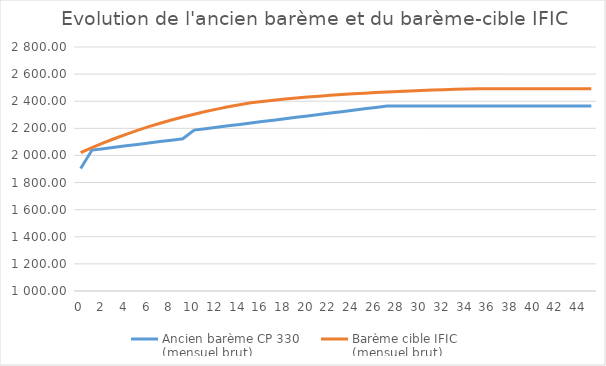
| Category | Ancien barème CP 330 
(mensuel brut) | Barème cible | Barème cible IFIC 
(mensuel brut) |
|---|---|---|---|
| 0.0 | 1903.62 |  | 2020.3 |
| 1.0 | 2039.52 |  | 2057.37 |
| 2.0 | 2049.96 |  | 2092.28 |
| 3.0 | 2060.39 |  | 2125.13 |
| 4.0 | 2070.83 |  | 2155.99 |
| 5.0 | 2081.26 |  | 2184.95 |
| 6.0 | 2091.69 |  | 2212.09 |
| 7.0 | 2102.12 |  | 2237.51 |
| 8.0 | 2112.55 |  | 2261.29 |
| 9.0 | 2122.99 |  | 2283.52 |
| 10.0 | 2187.23 |  | 2304.29 |
| 11.0 | 2197.66 |  | 2323.68 |
| 12.0 | 2208.1 |  | 2341.75 |
| 13.0 | 2218.53 |  | 2358.6 |
| 14.0 | 2228.96 |  | 2374.31 |
| 15.0 | 2239.4 |  | 2388.93 |
| 16.0 | 2249.83 |  | 2398.6 |
| 17.0 | 2260.26 |  | 2407.58 |
| 18.0 | 2270.7 |  | 2415.91 |
| 19.0 | 2281.13 |  | 2423.64 |
| 20.0 | 2291.57 |  | 2430.83 |
| 21.0 | 2302 |  | 2437.48 |
| 22.0 | 2312.43 |  | 2443.66 |
| 23.0 | 2322.87 |  | 2449.39 |
| 24.0 | 2333.3 |  | 2454.7 |
| 25.0 | 2343.73 |  | 2459.63 |
| 26.0 | 2354.17 |  | 2464.19 |
| 27.0 | 2364.6 |  | 2468.41 |
| 28.0 | 2364.6 |  | 2472.34 |
| 29.0 | 2364.6 |  | 2475.97 |
| 30.0 | 2364.6 |  | 2479.33 |
| 31.0 | 2364.6 |  | 2482.44 |
| 32.0 | 2364.6 |  | 2485.33 |
| 33.0 | 2364.6 |  | 2488 |
| 34.0 | 2364.6 |  | 2490.48 |
| 35.0 | 2364.6 |  | 2492.77 |
| 36.0 | 2364.6 |  | 2492.77 |
| 37.0 | 2364.6 |  | 2492.77 |
| 38.0 | 2364.6 |  | 2492.77 |
| 39.0 | 2364.6 |  | 2492.77 |
| 40.0 | 2364.6 |  | 2492.77 |
| 41.0 | 2364.6 |  | 2492.77 |
| 42.0 | 2364.6 |  | 2492.77 |
| 43.0 | 2364.6 |  | 2492.77 |
| 44.0 | 2364.6 |  | 2492.77 |
| 45.0 | 2364.6 |  | 2492.77 |